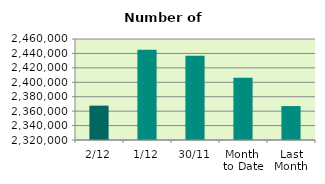
| Category | Series 0 |
|---|---|
| 2/12 | 2367618 |
| 1/12 | 2445142 |
| 30/11 | 2436650 |
| Month 
to Date | 2406380 |
| Last
Month | 2367033.455 |